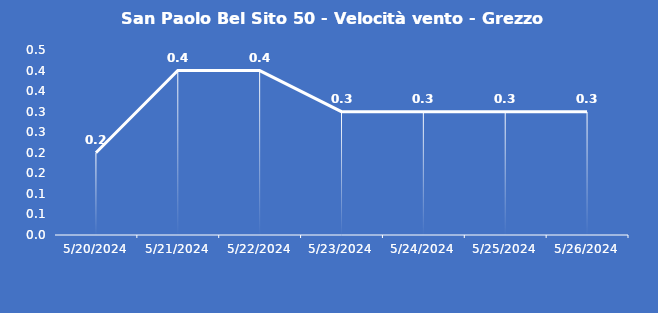
| Category | San Paolo Bel Sito 50 - Velocità vento - Grezzo (m/s) |
|---|---|
| 5/20/24 | 0.2 |
| 5/21/24 | 0.4 |
| 5/22/24 | 0.4 |
| 5/23/24 | 0.3 |
| 5/24/24 | 0.3 |
| 5/25/24 | 0.3 |
| 5/26/24 | 0.3 |